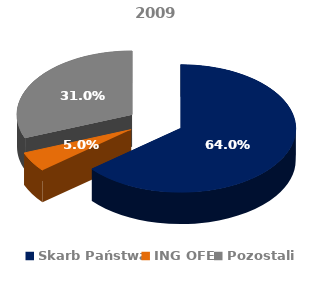
| Category | 2009 |
|---|---|
| Skarb Państwa | 0.64 |
| ING OFE | 0.05 |
| Pozostali | 0.31 |